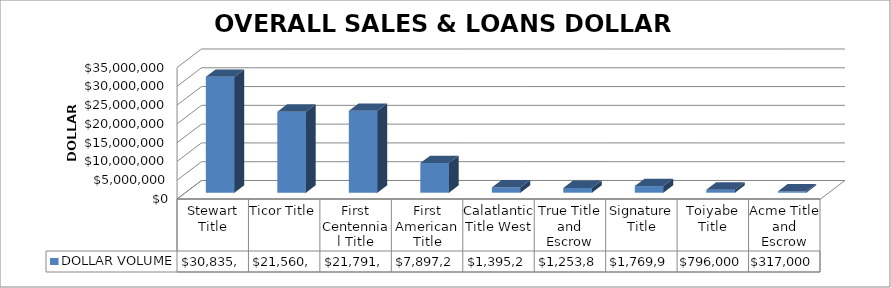
| Category | DOLLAR VOLUME |
|---|---|
| Stewart Title | 30835768 |
| Ticor Title | 21560665.31 |
| First Centennial Title | 21791752 |
| First American Title | 7897227 |
| Calatlantic Title West | 1395207 |
| True Title and Escrow | 1253800 |
| Signature Title | 1769900 |
| Toiyabe Title | 796000 |
| Acme Title and Escrow | 317000 |